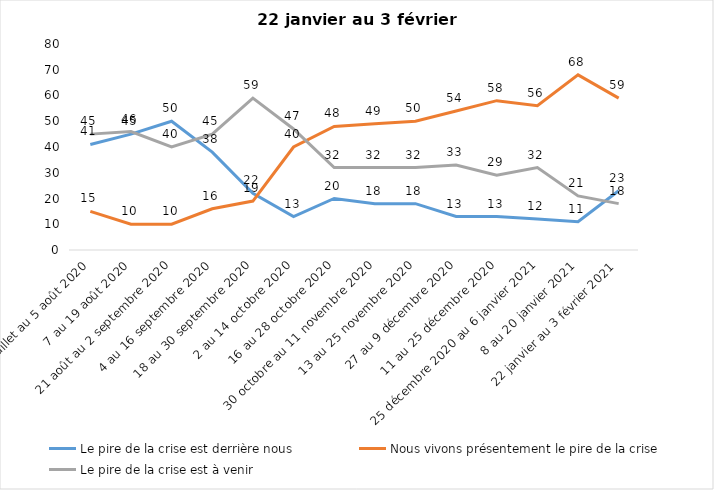
| Category | Le pire de la crise est derrière nous | Nous vivons présentement le pire de la crise | Le pire de la crise est à venir |
|---|---|---|---|
| 24 juillet au 5 août 2020 | 41 | 15 | 45 |
| 7 au 19 août 2020 | 45 | 10 | 46 |
| 21 août au 2 septembre 2020 | 50 | 10 | 40 |
| 4 au 16 septembre 2020 | 38 | 16 | 45 |
| 18 au 30 septembre 2020 | 22 | 19 | 59 |
| 2 au 14 octobre 2020 | 13 | 40 | 47 |
| 16 au 28 octobre 2020 | 20 | 48 | 32 |
| 30 octobre au 11 novembre 2020 | 18 | 49 | 32 |
| 13 au 25 novembre 2020 | 18 | 50 | 32 |
| 27 au 9 décembre 2020 | 13 | 54 | 33 |
| 11 au 25 décembre 2020 | 13 | 58 | 29 |
| 25 décembre 2020 au 6 janvier 2021 | 12 | 56 | 32 |
| 8 au 20 janvier 2021 | 11 | 68 | 21 |
| 22 janvier au 3 février 2021 | 23 | 59 | 18 |